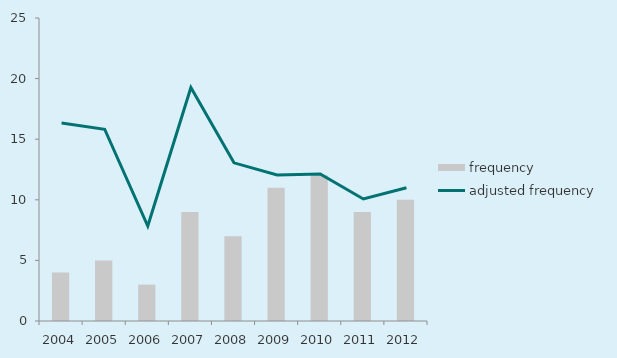
| Category | frequency |
|---|---|
| 2004.0 | 4 |
| 2005.0 | 5 |
| 2006.0 | 3 |
| 2007.0 | 9 |
| 2008.0 | 7 |
| 2009.0 | 11 |
| 2010.0 | 12 |
| 2011.0 | 9 |
| 2012.0 | 10 |